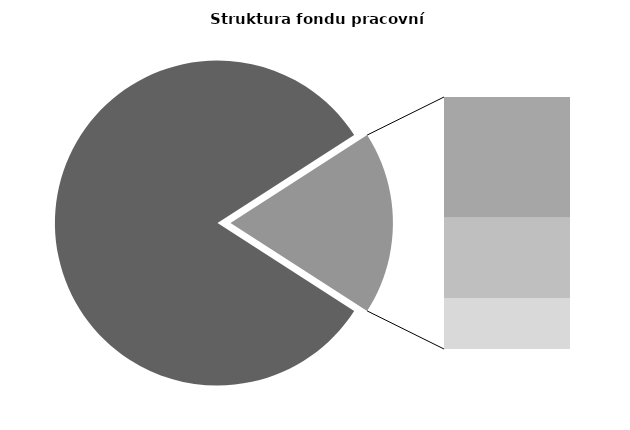
| Category | Series 0 |
|---|---|
| Průměrná měsíční odpracovaná doba bez přesčasu | 137.676 |
| Dovolená | 14.674 |
| Nemoc | 9.772 |
| Jiné | 6.184 |